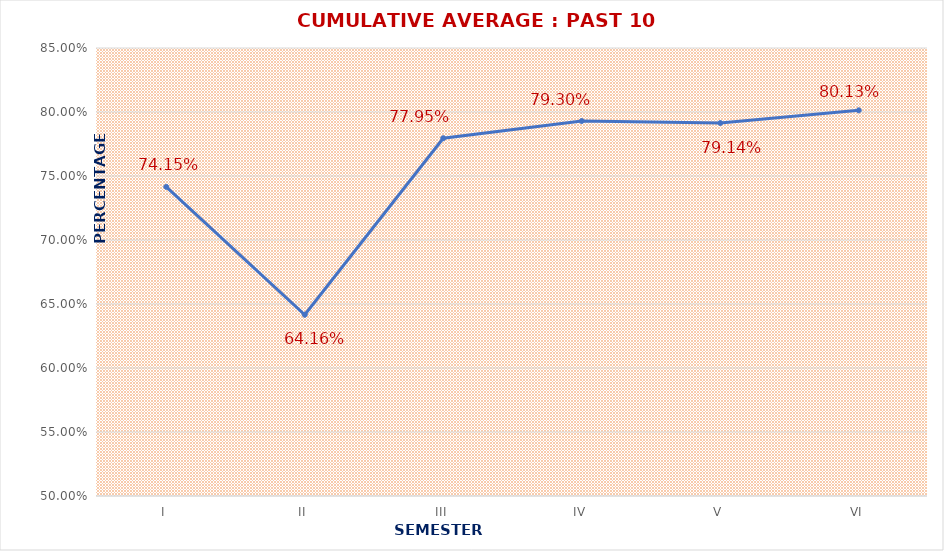
| Category | CUMULATIVE AVERAGE : PAST 10 YEARS |
|---|---|
| I | 0.742 |
| II | 0.642 |
| III | 0.78 |
| IV | 0.793 |
| V | 0.791 |
| VI | 0.801 |